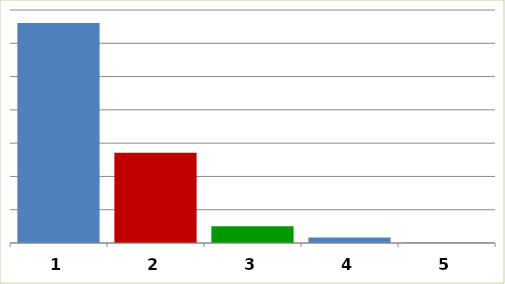
| Category | Series 0 |
|---|---|
| 0 | 66115777.04 |
| 1 | 27081580.16 |
| 2 | 5033799 |
| 3 | 1625000 |
| 4 | 139861.87 |